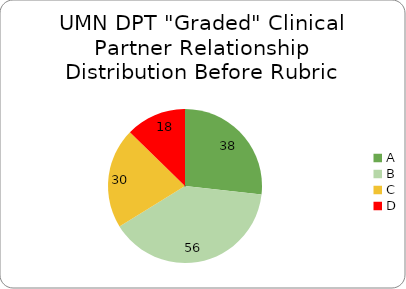
| Category | Number of partners  |
|---|---|
| A | 38 |
| B | 56 |
| C | 30 |
| D | 18 |